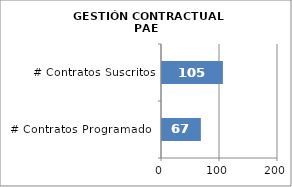
| Category | GESTIÓN CONTRACTUAL PAE |
|---|---|
| # Contratos Programados | 67 |
| # Contratos Suscritos | 105 |